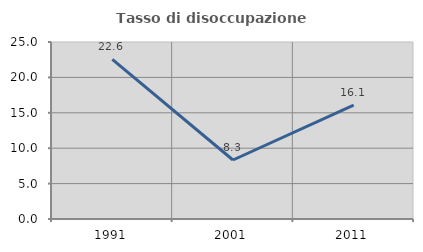
| Category | Tasso di disoccupazione giovanile  |
|---|---|
| 1991.0 | 22.556 |
| 2001.0 | 8.333 |
| 2011.0 | 16.071 |